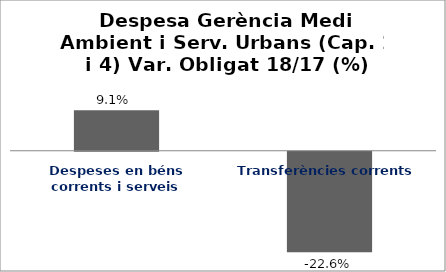
| Category | Series 0 |
|---|---|
| Despeses en béns corrents i serveis | 0.091 |
| Transferències corrents | -0.226 |